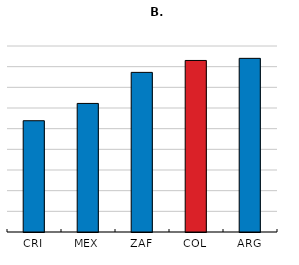
| Category | Self-employed |
|---|---|
| CRI | 53.839 |
| MEX | 62.215 |
| ZAF | 77.231 |
| COL | 83 |
| ARG | 84.026 |